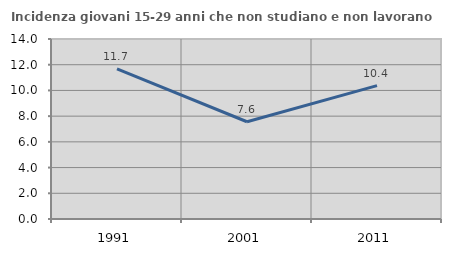
| Category | Incidenza giovani 15-29 anni che non studiano e non lavorano  |
|---|---|
| 1991.0 | 11.675 |
| 2001.0 | 7.565 |
| 2011.0 | 10.377 |